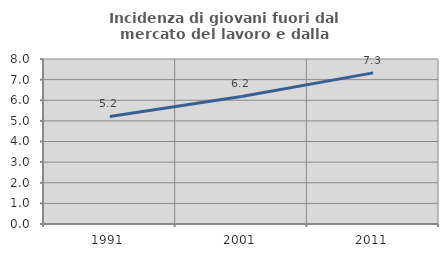
| Category | Incidenza di giovani fuori dal mercato del lavoro e dalla formazione  |
|---|---|
| 1991.0 | 5.216 |
| 2001.0 | 6.185 |
| 2011.0 | 7.327 |